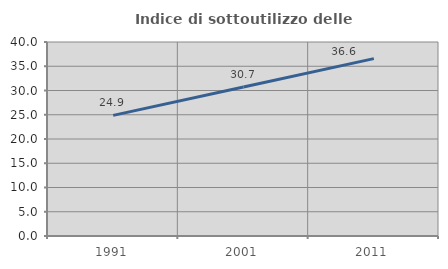
| Category | Indice di sottoutilizzo delle abitazioni  |
|---|---|
| 1991.0 | 24.878 |
| 2001.0 | 30.707 |
| 2011.0 | 36.572 |